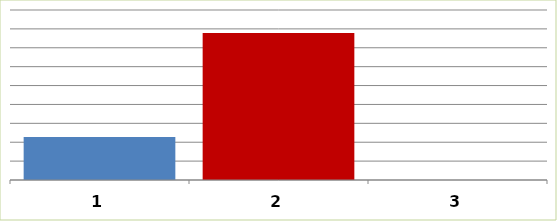
| Category | Series 0 |
|---|---|
| 0 | 22703469.6 |
| 1 | 77857027.3 |
| 2 | 0 |